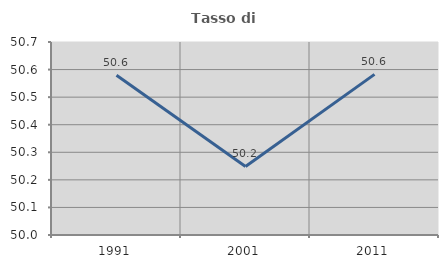
| Category | Tasso di occupazione   |
|---|---|
| 1991.0 | 50.579 |
| 2001.0 | 50.249 |
| 2011.0 | 50.583 |